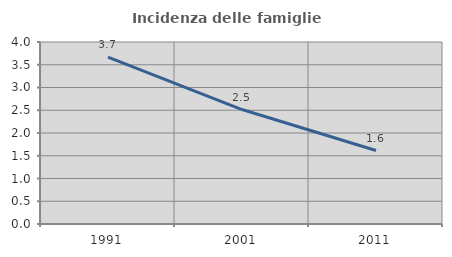
| Category | Incidenza delle famiglie numerose |
|---|---|
| 1991.0 | 3.67 |
| 2001.0 | 2.516 |
| 2011.0 | 1.615 |